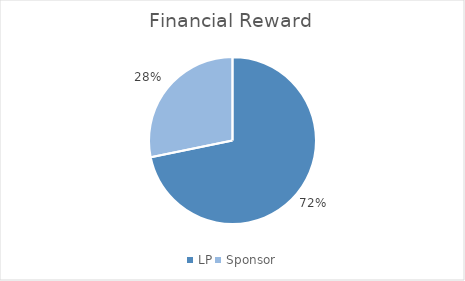
| Category | Series 0 |
|---|---|
| LP | 0.718 |
| Sponsor | 0.282 |